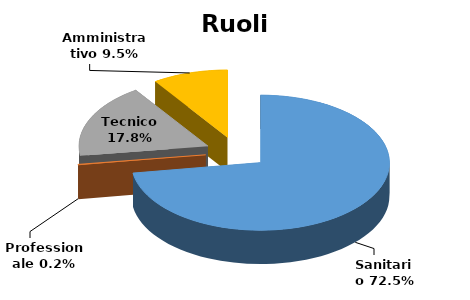
| Category | Series 0 |
|---|---|
| Sanitario | 0.725 |
| Professionale | 0.002 |
| Tecnico | 0.178 |
| Amministrativo | 0.095 |